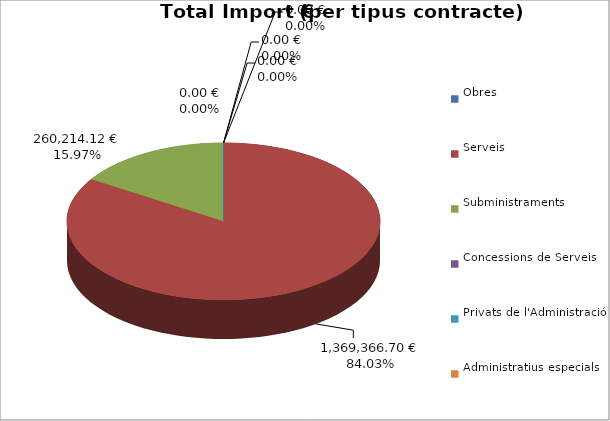
| Category | Total preu
(amb IVA) |
|---|---|
| Obres | 0 |
| Serveis | 1369366.705 |
| Subministraments | 260214.118 |
| Concessions de Serveis | 0 |
| Privats de l'Administració | 0 |
| Administratius especials | 0 |